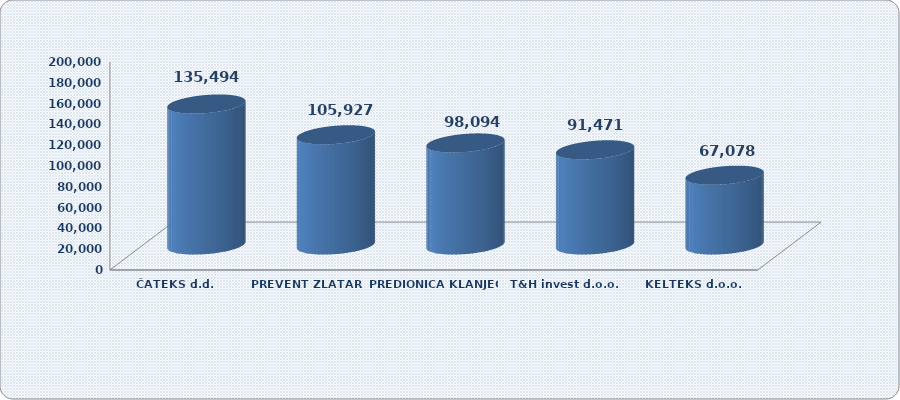
| Category | Ukupan prihod |
|---|---|
| ČATEKS d.d. | 135493.661 |
| PREVENT ZLATAR d.o.o | 105927.259 |
| PREDIONICA KLANJEC d.o.o. | 98094.36 |
| T&H invest d.o.o. | 91470.805 |
| KELTEKS d.o.o. | 67077.782 |